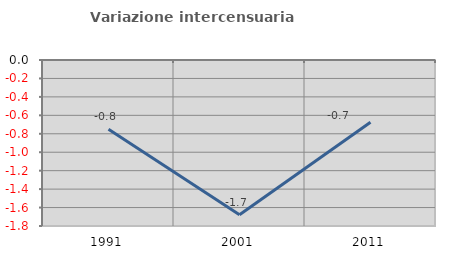
| Category | Variazione intercensuaria annua |
|---|---|
| 1991.0 | -0.75 |
| 2001.0 | -1.678 |
| 2011.0 | -0.676 |